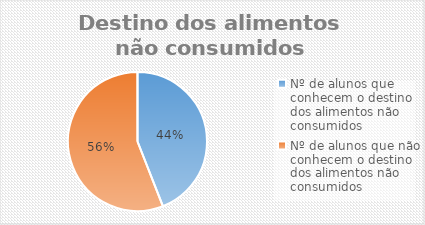
| Category | Series 6 |
|---|---|
| Nº de alunos que conhecem o destino dos alimentos não consumidos  | 37 |
| Nº de alunos que não conhecem o destino dos alimentos não consumidos  | 47 |